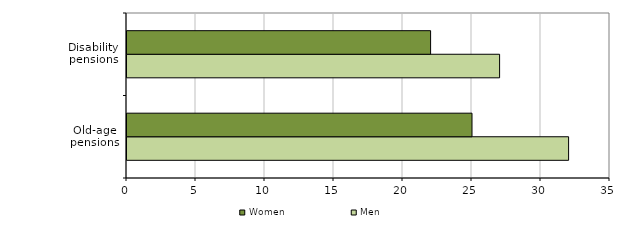
| Category | Men | Women |
|---|---|---|
| Old-age
pensions | 32 | 25 |
| Disability pensions | 27 | 22 |